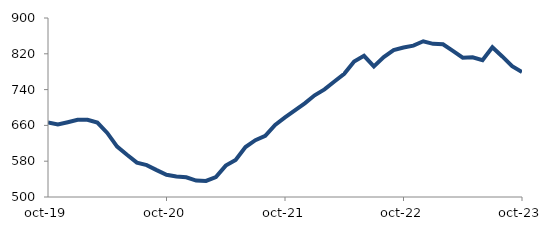
| Category | Series 0 |
|---|---|
| 2019-10-01 | 666.5 |
| 2019-11-01 | 662.174 |
| 2019-12-01 | 667.143 |
| 2020-01-01 | 672.455 |
| 2020-02-01 | 672.659 |
| 2020-03-01 | 666.213 |
| 2020-04-01 | 643.145 |
| 2020-05-01 | 612.572 |
| 2020-06-01 | 594.292 |
| 2020-07-01 | 576.858 |
| 2020-08-01 | 571.224 |
| 2020-09-01 | 560.032 |
| 2020-10-01 | 549.541 |
| 2020-11-01 | 545.982 |
| 2020-12-01 | 544.038 |
| 2021-01-01 | 536.772 |
| 2021-02-01 | 535.938 |
| 2021-03-01 | 544.717 |
| 2021-04-01 | 570.16 |
| 2021-05-01 | 582.981 |
| 2021-06-01 | 611.684 |
| 2021-07-01 | 627.037 |
| 2021-08-01 | 636.642 |
| 2021-09-01 | 661.114 |
| 2021-10-01 | 677.889 |
| 2021-11-01 | 693.389 |
| 2021-12-01 | 709.343 |
| 2022-01-01 | 727.31 |
| 2022-02-01 | 740.539 |
| 2022-03-01 | 758.027 |
| 2022-04-01 | 775.241 |
| 2022-05-01 | 802.956 |
| 2022-06-01 | 815.434 |
| 2022-07-01 | 791.89 |
| 2022-08-01 | 812.76 |
| 2022-09-01 | 828.12 |
| 2022-10-01 | 834 |
| 2022-11-01 | 838.178 |
| 2022-12-01 | 847.954 |
| 2023-01-01 | 842.285 |
| 2023-02-01 | 841.25 |
| 2023-03-01 | 826.38 |
| 2023-04-01 | 811.394 |
| 2023-05-01 | 812.228 |
| 2023-06-01 | 805.926 |
| 2023-07-01 | 834.815 |
| 2023-08-01 | 814.103 |
| 2023-09-01 | 792.442 |
| 2023-10-01 | 779.206 |